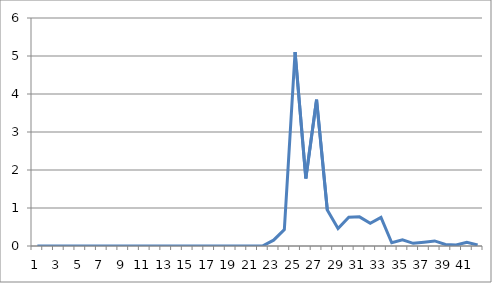
| Category | Series 0 |
|---|---|
| 0 | 0 |
| 1 | 0 |
| 2 | 0 |
| 3 | 0 |
| 4 | 0 |
| 5 | 0 |
| 6 | 0 |
| 7 | 0 |
| 8 | 0 |
| 9 | 0 |
| 10 | 0 |
| 11 | 0 |
| 12 | 0 |
| 13 | 0 |
| 14 | 0 |
| 15 | 0 |
| 16 | 0 |
| 17 | 0 |
| 18 | 0 |
| 19 | 0 |
| 20 | 0 |
| 21 | 0.005 |
| 22 | 0.153 |
| 23 | 0.433 |
| 24 | 5.105 |
| 25 | 1.778 |
| 26 | 3.851 |
| 27 | 0.947 |
| 28 | 0.459 |
| 29 | 0.756 |
| 30 | 0.767 |
| 31 | 0.599 |
| 32 | 0.753 |
| 33 | 0.085 |
| 34 | 0.164 |
| 35 | 0.071 |
| 36 | 0.101 |
| 37 | 0.134 |
| 38 | 0.042 |
| 39 | 0.027 |
| 40 | 0.096 |
| 41 | 0.028 |